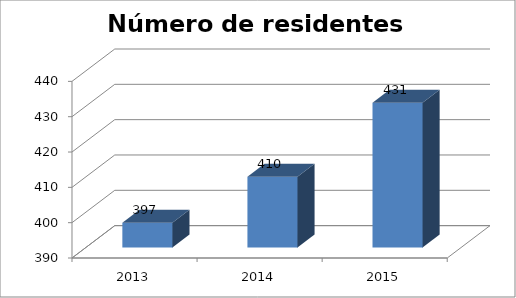
| Category | Número de residentes totales |
|---|---|
| 2013 | 397 |
| 2014 | 410 |
| 2015 | 431 |